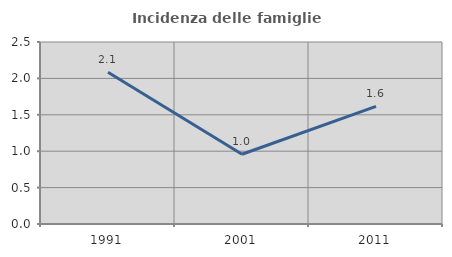
| Category | Incidenza delle famiglie numerose |
|---|---|
| 1991.0 | 2.085 |
| 2001.0 | 0.958 |
| 2011.0 | 1.615 |